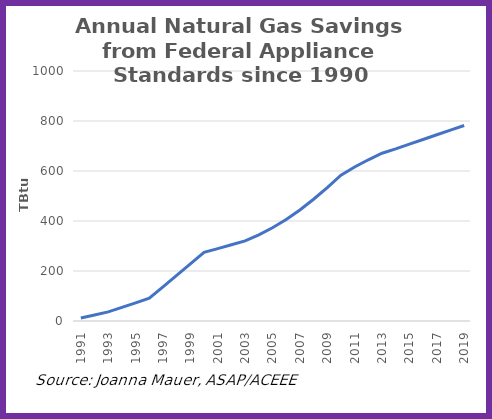
| Category | Series 0 |
|---|---|
| 1991.0 | 12.105 |
| 1992.0 | 24.21 |
| 1993.0 | 36.314 |
| 1994.0 | 54.511 |
| 1995.0 | 72.708 |
| 1996.0 | 90.905 |
| 1997.0 | 136.751 |
| 1998.0 | 182.596 |
| 1999.0 | 228.441 |
| 2000.0 | 274.287 |
| 2001.0 | 289.673 |
| 2002.0 | 305.06 |
| 2003.0 | 320.446 |
| 2004.0 | 344.201 |
| 2005.0 | 372.736 |
| 2006.0 | 405.975 |
| 2007.0 | 443.918 |
| 2008.0 | 487.108 |
| 2009.0 | 533.758 |
| 2010.0 | 583.052 |
| 2011.0 | 615.835 |
| 2012.0 | 644.817 |
| 2013.0 | 671.021 |
| 2014.0 | 688.352 |
| 2015.0 | 707.464 |
| 2016.0 | 726.138 |
| 2017.0 | 744.926 |
| 2018.0 | 763.764 |
| 2019.0 | 782.118 |